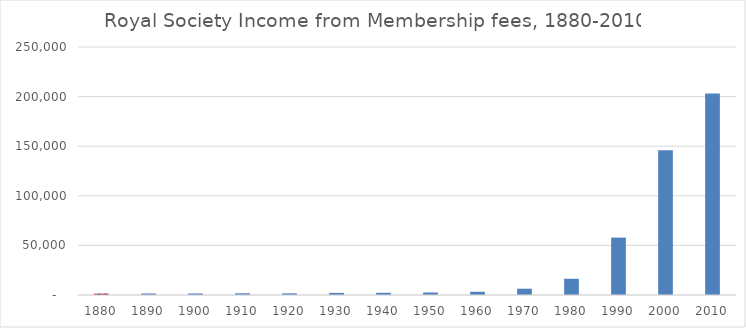
| Category | Fees |
|---|---|
| 1880.0 | 1475 |
| 1890.0 | 1526 |
| 1900.0 | 1550 |
| 1910.0 | 1727.246 |
| 1920.0 | 1683.558 |
| 1930.0 | 2120 |
| 1940.0 | 2210 |
| 1950.0 | 2530 |
| 1960.0 | 3255 |
| 1970.0 | 6340 |
| 1980.0 | 16340 |
| 1990.0 | 57849 |
| 2000.0 | 146000 |
| 2010.0 | 203000 |